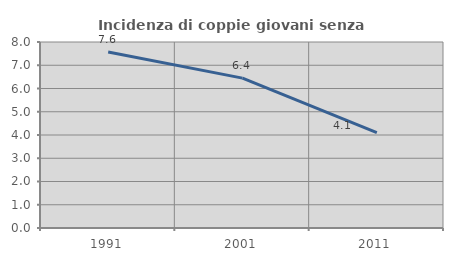
| Category | Incidenza di coppie giovani senza figli |
|---|---|
| 1991.0 | 7.573 |
| 2001.0 | 6.447 |
| 2011.0 | 4.106 |